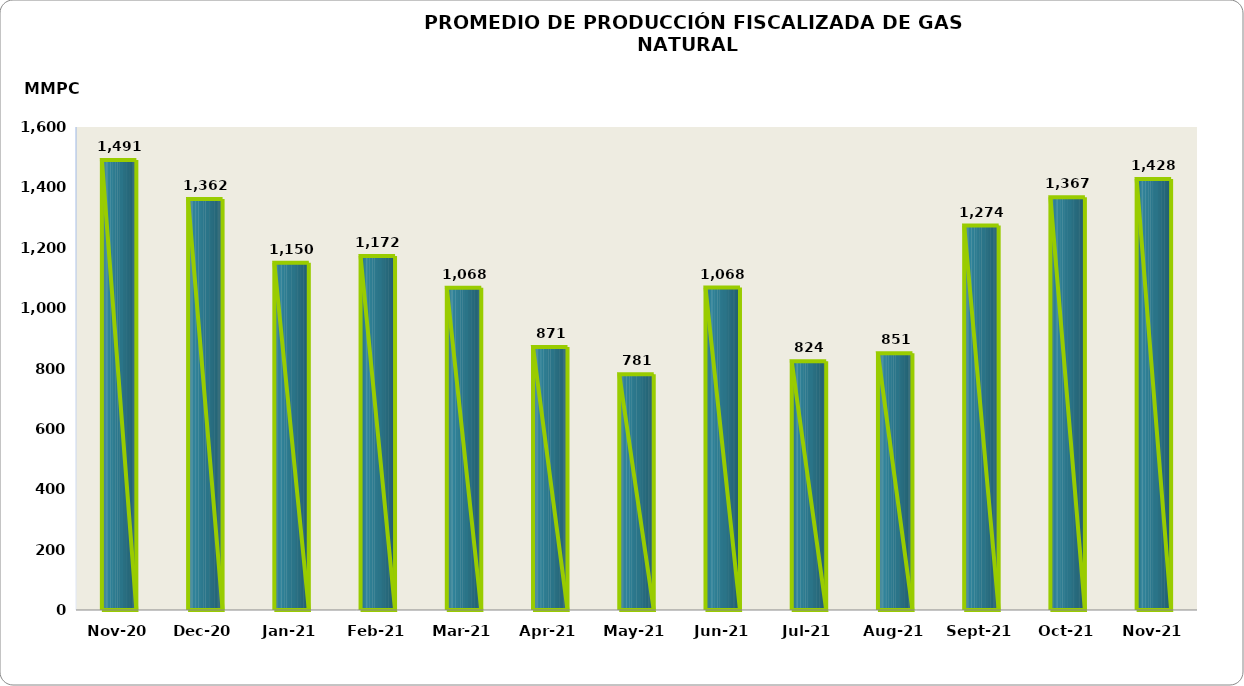
| Category | Series 0 |
|---|---|
| 2020-11-01 | 1490754.692 |
| 2020-12-01 | 1361515.502 |
| 2021-01-01 | 1150031.71 |
| 2021-02-01 | 1172289.733 |
| 2021-03-01 | 1067744.591 |
| 2021-04-01 | 871274.072 |
| 2021-05-01 | 780865.314 |
| 2021-06-01 | 1068128.403 |
| 2021-07-01 | 823834.105 |
| 2021-08-01 | 850929.254 |
| 2021-09-01 | 1273570.561 |
| 2021-10-01 | 1367318.609 |
| 2021-11-01 | 1428097.616 |